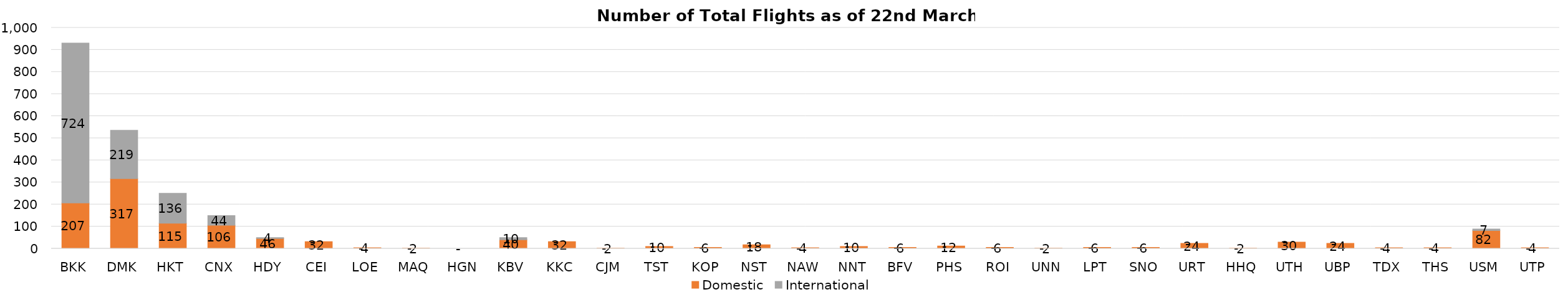
| Category | Domestic | International |
|---|---|---|
| BKK | 207 | 724 |
| DMK | 317 | 219 |
| HKT | 115 | 136 |
| CNX | 106 | 44 |
| HDY | 46 | 4 |
| CEI | 32 | 0 |
| LOE | 4 | 0 |
| MAQ | 2 | 0 |
| HGN | 0 | 0 |
| KBV | 40 | 10 |
| KKC | 32 | 0 |
| CJM | 2 | 0 |
| TST | 10 | 0 |
| KOP | 6 | 0 |
| NST | 18 | 0 |
| NAW | 4 | 0 |
| NNT | 10 | 0 |
| BFV | 6 | 0 |
| PHS | 12 | 0 |
| ROI | 6 | 0 |
| UNN | 2 | 0 |
| LPT | 6 | 0 |
| SNO | 6 | 0 |
| URT | 24 | 0 |
| HHQ | 2 | 0 |
| UTH | 30 | 0 |
| UBP | 24 | 0 |
| TDX | 4 | 0 |
| THS | 4 | 0 |
| USM | 82 | 7 |
| UTP | 4 | 0 |